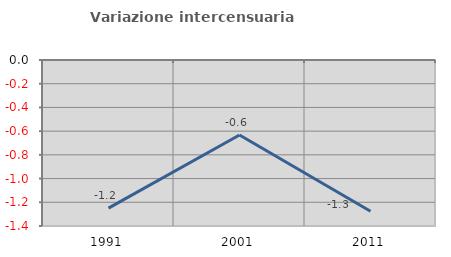
| Category | Variazione intercensuaria annua |
|---|---|
| 1991.0 | -1.25 |
| 2001.0 | -0.632 |
| 2011.0 | -1.275 |